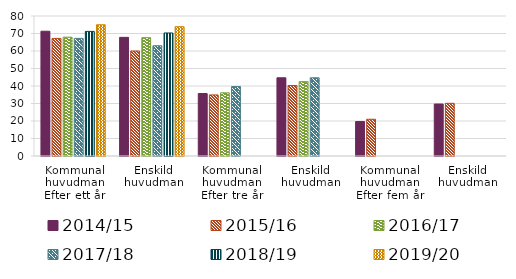
| Category | 2014/15 | 2015/16 | 2016/17 | 2017/18 | 2018/19 | 2019/20 |
|---|---|---|---|---|---|---|
| 0 | 71.3 | 67.2 | 67.9 | 67.2 | 71.2 | 75 |
| 1 | 67.8 | 60 | 67.6 | 63 | 70.3 | 73.9 |
| 2 | 35.7 | 34.9 | 36.1 | 39.7 | 0 | 0 |
| 3 | 44.7 | 40.3 | 42.5 | 44.7 | 0 | 0 |
| 4 | 19.7 | 21 | 0 | 0 | 0 | 0 |
| 5 | 29.7 | 30.1 | 0 | 0 | 0 | 0 |